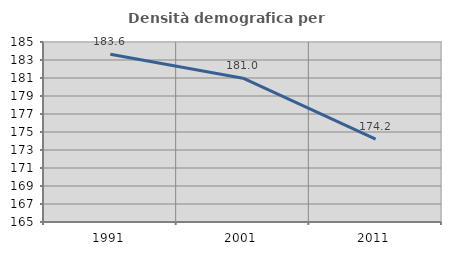
| Category | Densità demografica |
|---|---|
| 1991.0 | 183.64 |
| 2001.0 | 180.979 |
| 2011.0 | 174.202 |